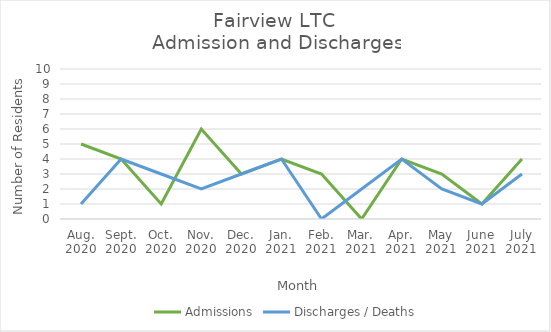
| Category | Admissions | Discharges / Deaths |
|---|---|---|
| Aug.
2020 | 5 | 1 |
| Sept.
2020 | 4 | 4 |
| Oct.
2020 | 1 | 3 |
| Nov.
2020 | 6 | 2 |
| Dec.
2020 | 3 | 3 |
| Jan.
2021 | 4 | 4 |
| Feb.
2021 | 3 | 0 |
| Mar.
2021 | 0 | 2 |
| Apr.
2021 | 4 | 4 |
| May
2021 | 3 | 2 |
| June
2021 | 1 | 1 |
| July
2021 | 4 | 3 |